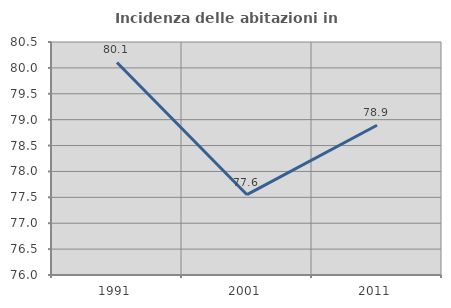
| Category | Incidenza delle abitazioni in proprietà  |
|---|---|
| 1991.0 | 80.105 |
| 2001.0 | 77.551 |
| 2011.0 | 78.892 |